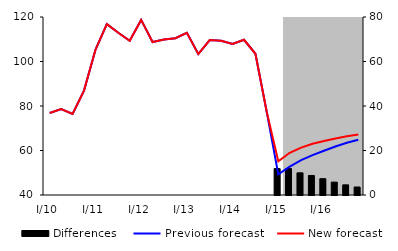
| Category | Differences |
|---|---|
| 0 | 0 |
| 1 | 0 |
| 2 | 0 |
| 3 | 0 |
| 4 | 0 |
| 5 | 0 |
| 6 | 0 |
| 7 | 0 |
| 8 | 0 |
| 9 | 0 |
| 10 | 0 |
| 11 | 0 |
| 12 | 0 |
| 13 | 0 |
| 14 | 0 |
| 15 | 0 |
| 16 | 0 |
| 17 | 0 |
| 18 | 0 |
| 19 | 0 |
| 20 | 11.866 |
| 21 | 11.878 |
| 22 | 9.97 |
| 23 | 8.782 |
| 24 | 7.334 |
| 25 | 5.78 |
| 26 | 4.564 |
| 27 | 3.598 |